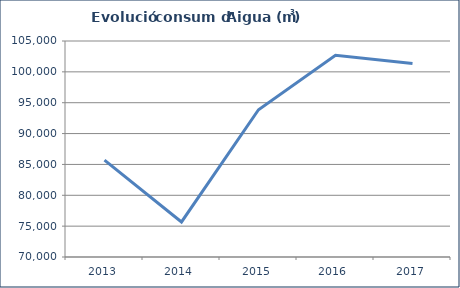
| Category | Aigua (m3) |
|---|---|
| 2013.0 | 85688 |
| 2014.0 | 75679 |
| 2015.0 | 93856 |
| 2016.0 | 102674 |
| 2017.0 | 101340 |